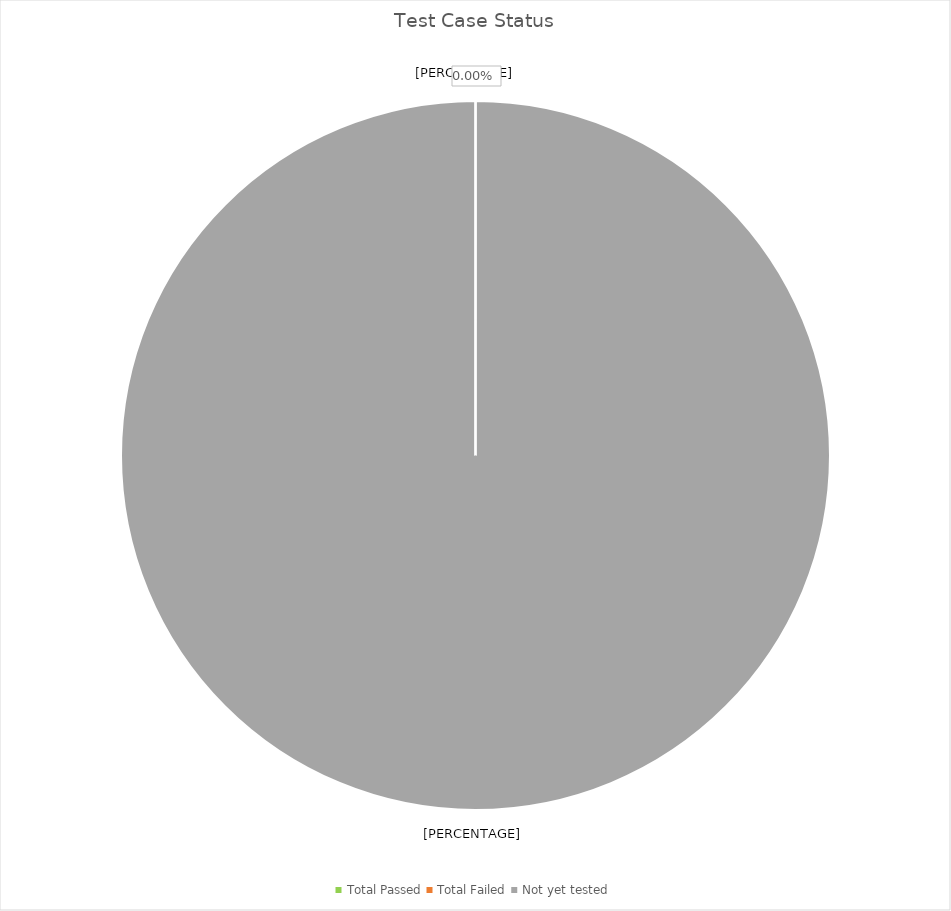
| Category | Series 0 |
|---|---|
| Total Passed | 0 |
| Total Failed | 0 |
| Not yet tested | 117 |